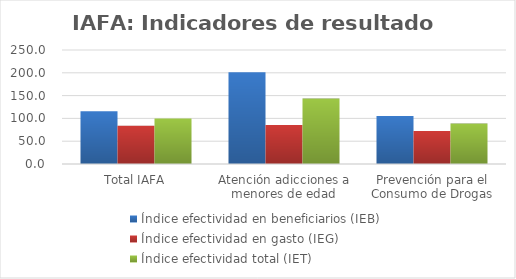
| Category | Índice efectividad en beneficiarios (IEB) | Índice efectividad en gasto (IEG)  | Índice efectividad total (IET) |
|---|---|---|---|
| Total IAFA | 115.842 | 83.901 | 99.872 |
| Atención adicciones a menores de edad | 201.08 | 85.718 | 143.399 |
| Prevención para el Consumo de Drogas | 105.044 | 72.401 | 88.723 |